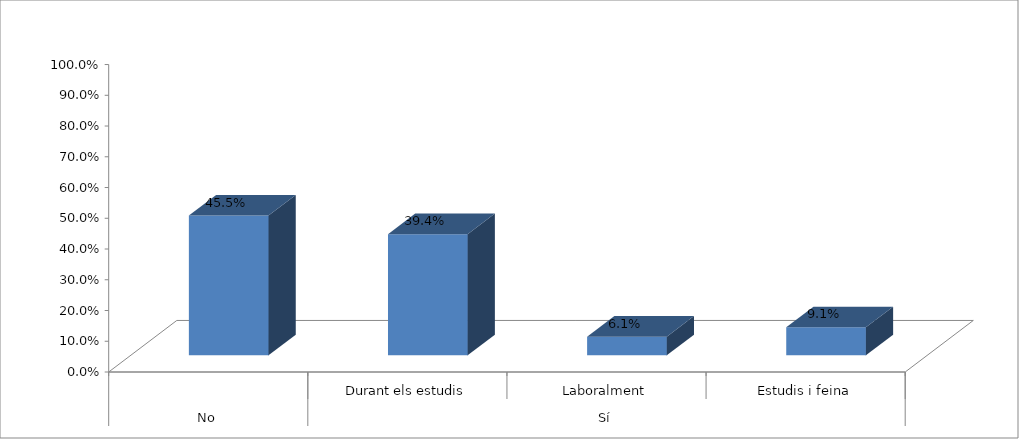
| Category | ARQUITECTURA |
|---|---|
| 0 | 0.455 |
| 1 | 0.394 |
| 2 | 0.061 |
| 3 | 0.091 |